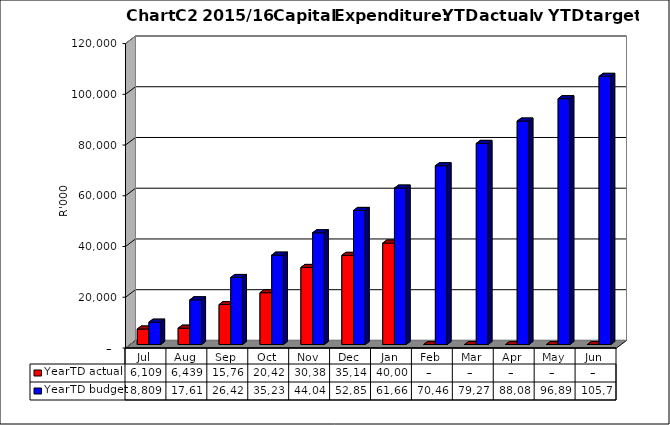
| Category | YearTD actual | YearTD budget |
|---|---|---|
| Jul | 6108587 | 8808585.26 |
| Aug | 6439262 | 17617170.52 |
| Sep | 15760781 | 26425755.78 |
| Oct | 20424714 | 35234341.04 |
| Nov | 30383869 | 44042926.3 |
| Dec | 35145694 | 52851511.56 |
| Jan | 40003745 | 61660096.821 |
| Feb | 0 | 70468682.081 |
| Mar | 0 | 79277267.341 |
| Apr | 0 | 88085852.601 |
| May | 0 | 96894437.861 |
| Jun | 0 | 105703023.121 |